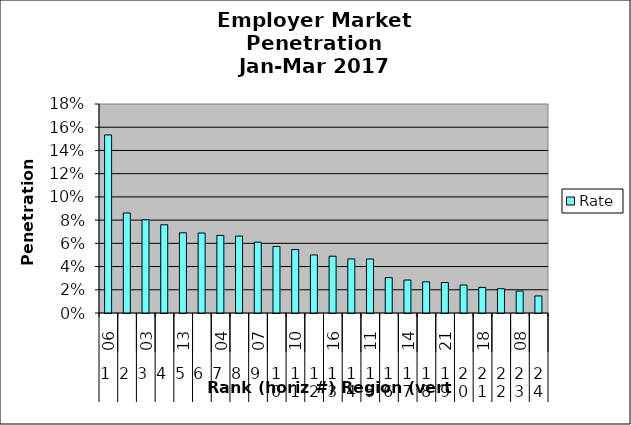
| Category | Rate |
|---|---|
| 0 | 0.153 |
| 1 | 0.086 |
| 2 | 0.08 |
| 3 | 0.076 |
| 4 | 0.069 |
| 5 | 0.069 |
| 6 | 0.067 |
| 7 | 0.066 |
| 8 | 0.061 |
| 9 | 0.057 |
| 10 | 0.055 |
| 11 | 0.05 |
| 12 | 0.049 |
| 13 | 0.047 |
| 14 | 0.046 |
| 15 | 0.031 |
| 16 | 0.028 |
| 17 | 0.027 |
| 18 | 0.026 |
| 19 | 0.024 |
| 20 | 0.022 |
| 21 | 0.021 |
| 22 | 0.019 |
| 23 | 0.015 |